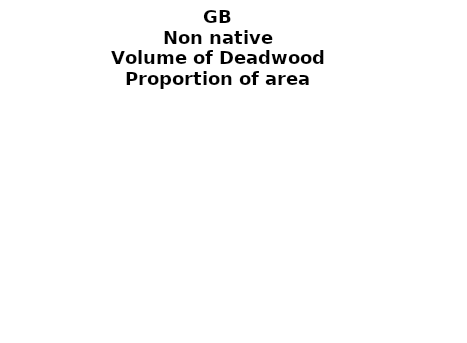
| Category | Non native |
|---|---|
|  None | 0.187 |
| >0 and ≤ 10 | 0.116 |
| >10 and ≤ 20  | 0.046 |
| >20 and ≤ 30  | 0.03 |
| >30 and ≤ 40  | 0.02 |
| >40 and ≤ 50  | 0.014 |
| >50 and ≤ 60  | 0.012 |
| >60 and ≤ 70  | 0.01 |
| >70 and ≤ 80  | 0.008 |
| >80 and ≤ 90  | 0.006 |
| >90 and ≤ 100  | 0.005 |
| >100 and ≤ 150 | 0.014 |
| >150 and ≤ 200  | 0.005 |
| >200 and ≤ 500 | 0.005 |
| >500   | 0 |